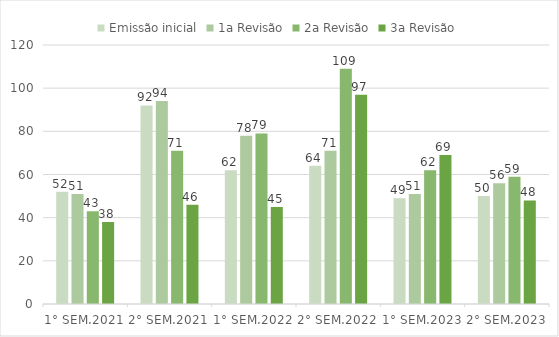
| Category | Emissão inicial | 1a Revisão | 2a Revisão | 3a Revisão |
|---|---|---|---|---|
| 1° SEM.2021 | 52 | 51 | 43 | 38 |
| 2° SEM.2021 | 92 | 94 | 71 | 46 |
| 1° SEM.2022 | 62 | 78 | 79 | 45 |
| 2° SEM.2022 | 64 | 71 | 109 | 97 |
| 1° SEM.2023 | 49 | 51 | 62 | 69 |
| 2° SEM.2023 | 50 | 56 | 59 | 48 |